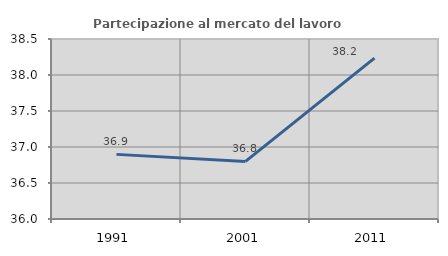
| Category | Partecipazione al mercato del lavoro  femminile |
|---|---|
| 1991.0 | 36.898 |
| 2001.0 | 36.8 |
| 2011.0 | 38.235 |